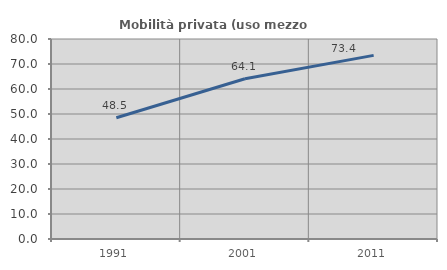
| Category | Mobilità privata (uso mezzo privato) |
|---|---|
| 1991.0 | 48.506 |
| 2001.0 | 64.085 |
| 2011.0 | 73.448 |